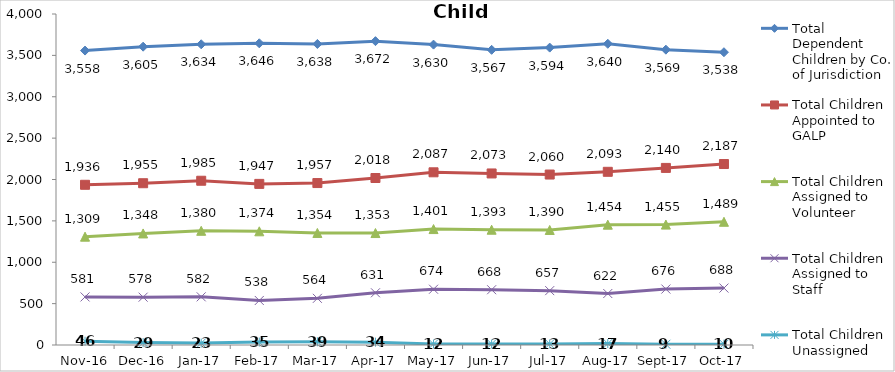
| Category | Total Dependent Children by Co. of Jurisdiction | Total Children Appointed to GALP | Total Children Assigned to Volunteer | Total Children Assigned to Staff | Total Children Unassigned |
|---|---|---|---|---|---|
| 2016-11-01 | 3558 | 1936 | 1309 | 581 | 46 |
| 2016-12-01 | 3605 | 1955 | 1348 | 578 | 29 |
| 2017-01-01 | 3634 | 1985 | 1380 | 582 | 23 |
| 2017-02-01 | 3646 | 1947 | 1374 | 538 | 35 |
| 2017-03-01 | 3638 | 1957 | 1354 | 564 | 39 |
| 2017-04-01 | 3672 | 2018 | 1353 | 631 | 34 |
| 2017-05-01 | 3630 | 2087 | 1401 | 674 | 12 |
| 2017-06-01 | 3567 | 2073 | 1393 | 668 | 12 |
| 2017-07-01 | 3594 | 2060 | 1390 | 657 | 13 |
| 2017-08-01 | 3640 | 2093 | 1454 | 622 | 17 |
| 2017-09-01 | 3569 | 2140 | 1455 | 676 | 9 |
| 2017-10-01 | 3538 | 2187 | 1489 | 688 | 10 |